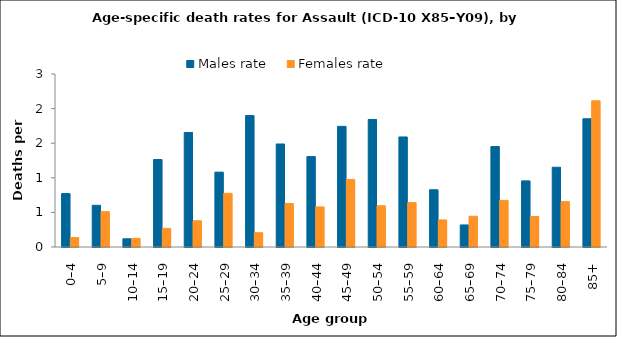
| Category | Males rate | Females rate |
|---|---|---|
| 0–4 | 0.772 | 0.136 |
| 5–9 | 0.603 | 0.511 |
| 10–14 | 0.119 | 0.126 |
| 15–19 | 1.265 | 0.269 |
| 20–24 | 1.655 | 0.379 |
| 25–29 | 1.082 | 0.776 |
| 30–34 | 1.9 | 0.207 |
| 35–39 | 1.489 | 0.629 |
| 40–44 | 1.307 | 0.579 |
| 45–49 | 1.743 | 0.976 |
| 50–54 | 1.843 | 0.595 |
| 55–59 | 1.59 | 0.641 |
| 60–64 | 0.827 | 0.391 |
| 65–69 | 0.319 | 0.444 |
| 70–74 | 1.451 | 0.674 |
| 75–79 | 0.955 | 0.44 |
| 80–84 | 1.153 | 0.655 |
| 85+ | 1.853 | 2.113 |